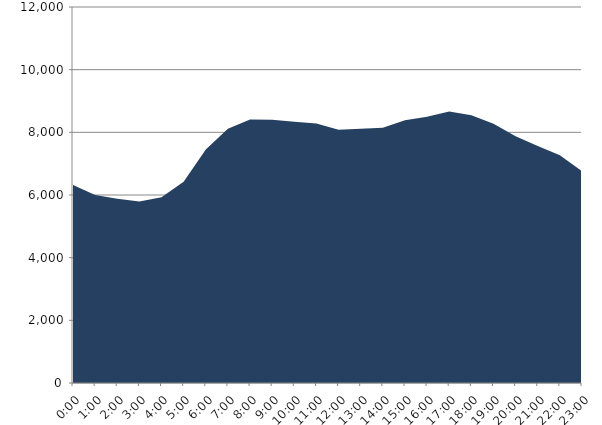
| Category | Series 0 | Series 1 |
|---|---|---|
| 2023-06-21 |  | 6315.66 |
| 2023-06-21 01:00:00 |  | 5997.981 |
| 2023-06-21 02:00:00 |  | 5880.782 |
| 2023-06-21 03:00:00 |  | 5790.659 |
| 2023-06-21 04:00:00 |  | 5925.233 |
| 2023-06-21 05:00:00 |  | 6422.976 |
| 2023-06-21 06:00:00 |  | 7453.159 |
| 2023-06-21 07:00:00 |  | 8113.567 |
| 2023-06-21 08:00:00 |  | 8411.102 |
| 2023-06-21 09:00:00 |  | 8401.179 |
| 2023-06-21 10:00:00 |  | 8340.099 |
| 2023-06-21 11:00:00 |  | 8284.944 |
| 2023-06-21 12:00:00 |  | 8079.612 |
| 2023-06-21 13:00:00 |  | 8118.303 |
| 2023-06-21 14:00:00 |  | 8147.644 |
| 2023-06-21 15:00:00 |  | 8383.882 |
| 2023-06-21 16:00:00 |  | 8495.3 |
| 2023-06-21 17:00:00 |  | 8662.802 |
| 2023-06-21 18:00:00 |  | 8545.502 |
| 2023-06-21 19:00:00 |  | 8273.309 |
| 2023-06-21 20:00:00 |  | 7871.533 |
| 2023-06-21 21:00:00 |  | 7567.377 |
| 2023-06-21 22:00:00 |  | 7266.11 |
| 2023-06-21 23:00:00 |  | 6763.082 |